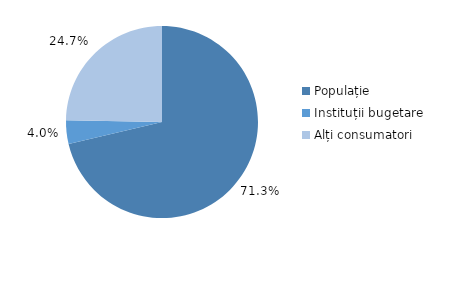
| Category | Series 0 |
|---|---|
| Populație | 0.713 |
| Instituții bugetare | 0.04 |
| Alți consumatori | 0.247 |